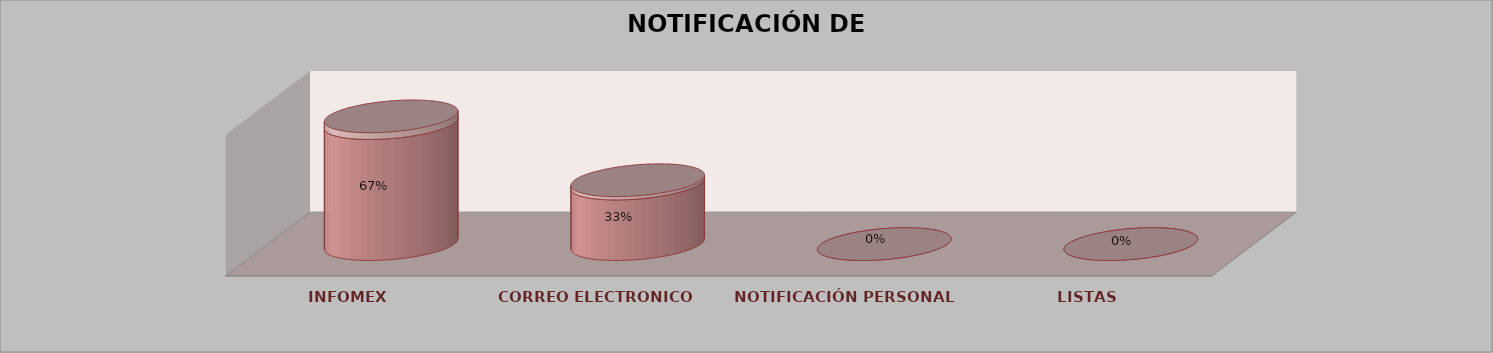
| Category | Series 0 | Series 1 | Series 2 | Series 3 | Series 4 |
|---|---|---|---|---|---|
| INFOMEX |  |  |  | 12 | 0.667 |
| CORREO ELECTRONICO |  |  |  | 6 | 0.333 |
| NOTIFICACIÓN PERSONAL |  |  |  | 0 | 0 |
| LISTAS |  |  |  | 0 | 0 |